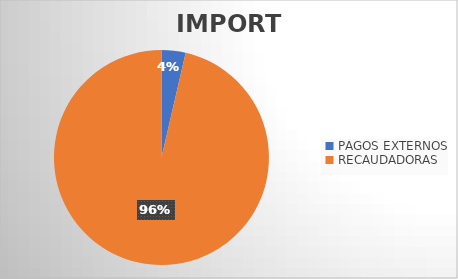
| Category | IMPORTE |
|---|---|
| PAGOS EXTERNOS | 9226674.14 |
| RECAUDADORAS | 246014022.5 |